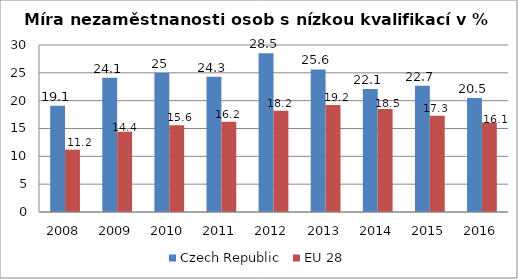
| Category | Czech Republic | EU 28 |
|---|---|---|
| 2008 | 19.1 | 11.2 |
| 2009 | 24.1 | 14.4 |
| 2010 | 25 | 15.6 |
| 2011 | 24.3 | 16.2 |
| 2012 | 28.5 | 18.2 |
| 2013 | 25.6 | 19.2 |
| 2014 | 22.1 | 18.5 |
| 2015 | 22.7 | 17.3 |
| 2016 | 20.5 | 16.1 |